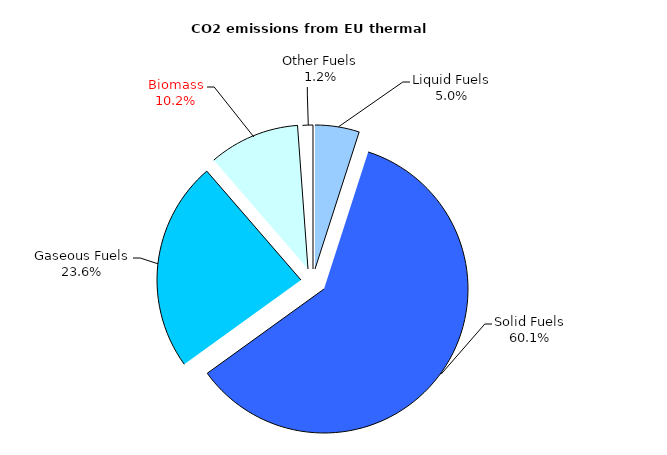
| Category | Series 0 |
|---|---|
| Liquid Fuels | 0.05 |
| Solid Fuels | 0.601 |
| Gaseous Fuels | 0.236 |
| Biomass | 0.102 |
| Other Fuels | 0.012 |